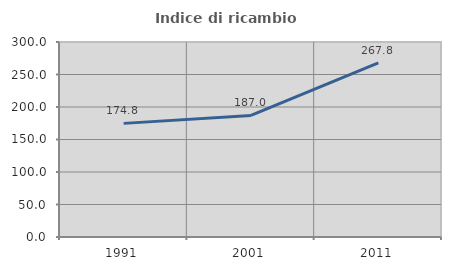
| Category | Indice di ricambio occupazionale  |
|---|---|
| 1991.0 | 174.809 |
| 2001.0 | 187.031 |
| 2011.0 | 267.845 |